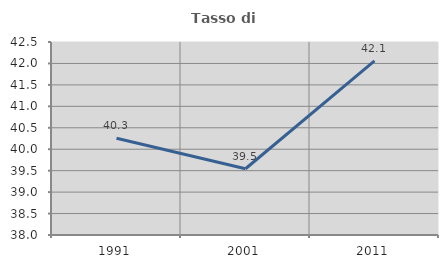
| Category | Tasso di occupazione   |
|---|---|
| 1991.0 | 40.254 |
| 2001.0 | 39.545 |
| 2011.0 | 42.062 |